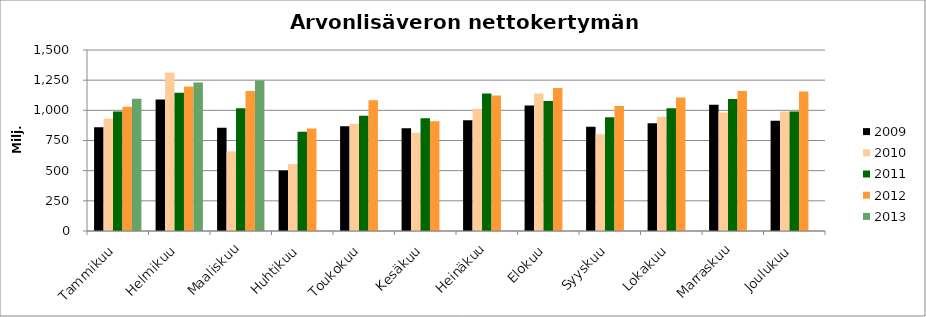
| Category | 2009 | 2010 | 2011 | 2012 | 2013 |
|---|---|---|---|---|---|
| Tammikuu | 858.934 | 929.369 | 989.979 | 1030.641 | 1096.075 |
| Helmikuu | 1089.664 | 1313.151 | 1145.438 | 1198.153 | 1230.33 |
| Maaliskuu | 856.122 | 659.776 | 1016.463 | 1160.067 | 1247.422 |
| Huhtikuu | 501.743 | 554.255 | 821.506 | 848.926 | 0 |
| Toukokuu | 867.163 | 889.769 | 955.963 | 1083.741 | 0 |
| Kesäkuu | 851.056 | 814.024 | 933.418 | 909.246 | 0 |
| Heinäkuu | 918.059 | 1013.537 | 1139.789 | 1122.196 | 0 |
| Elokuu | 1040.537 | 1139.703 | 1077.137 | 1184.622 | 0 |
| Syyskuu | 863.546 | 801.068 | 941.737 | 1035.954 | 0 |
| Lokakuu | 892.063 | 947.674 | 1018.067 | 1107.374 | 0 |
| Marraskuu | 1046.386 | 981.431 | 1094.661 | 1159.214 | 0 |
| Joulukuu | 914.348 | 991.049 | 989.325 | 1156.453 | 0 |